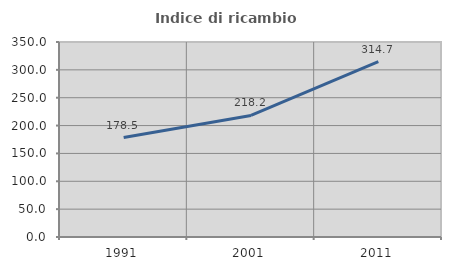
| Category | Indice di ricambio occupazionale  |
|---|---|
| 1991.0 | 178.519 |
| 2001.0 | 218.182 |
| 2011.0 | 314.737 |